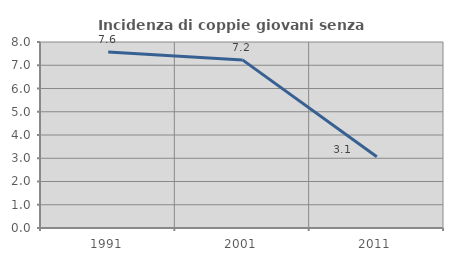
| Category | Incidenza di coppie giovani senza figli |
|---|---|
| 1991.0 | 7.567 |
| 2001.0 | 7.23 |
| 2011.0 | 3.063 |